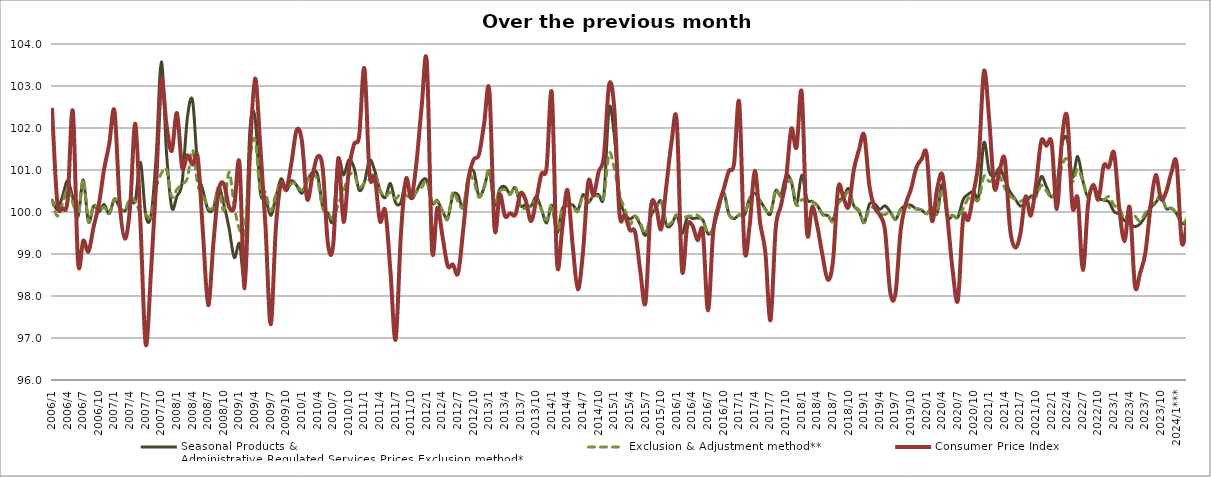
| Category | Seasonal Products &
Administrative Regulated Services Prices Exclusion method* | Exclusion & Adjustment method** | Consumer Price Index |
|---|---|---|---|
| 2006/1 | 100.292 | 100.289 | 102.48 |
| 2006/2 | 100.058 | 99.904 | 100.249 |
| 2006/3 | 100.367 | 100.199 | 100.091 |
| 2006/4 | 100.746 | 100.556 | 100.284 |
| 2006/5 | 100.337 | 100.21 | 102.403 |
| 2006/6 | 99.894 | 99.885 | 98.806 |
| 2006/7 | 100.763 | 100.777 | 99.319 |
| 2006/8 | 99.764 | 99.771 | 99.057 |
| 2006/9 | 100.145 | 100.175 | 99.652 |
| 2006/10 | 100.003 | 100.009 | 100.179 |
| 2006/11 | 100.179 | 100.118 | 101.012 |
| 2006/12 | 99.961 | 99.958 | 101.624 |
| 2007/1 | 100.309 | 100.32 | 102.405 |
| 2007/2 | 100.101 | 100.12 | 100.211 |
| 2007/3 | 100.026 | 100.035 | 99.366 |
| 2007/4 | 100.275 | 100.339 | 100.125 |
| 2007/5 | 100.272 | 100.245 | 102.102 |
| 2007/6 | 101.179 | 99.968 | 99.693 |
| 2007/7 | 99.924 | 99.937 | 96.845 |
| 2007/8 | 99.907 | 99.907 | 98.539 |
| 2007/9 | 101.308 | 100.57 | 100.675 |
| 2007/10 | 103.575 | 100.916 | 103.129 |
| 2007/11 | 101.402 | 101.015 | 102.068 |
| 2007/12 | 100.108 | 100.362 | 101.456 |
| 2008/1 | 100.375 | 100.542 | 102.354 |
| 2008/2 | 100.711 | 100.662 | 101.056 |
| 2008/3 | 102.242 | 100.806 | 101.354 |
| 2008/4 | 102.647 | 101.473 | 101.13 |
| 2008/5 | 101.034 | 100.651 | 101.298 |
| 2008/6 | 100.508 | 100.388 | 99.486 |
| 2008/7 | 100.048 | 100.096 | 97.781 |
| 2008/8 | 100.081 | 100.123 | 99.26 |
| 2008/9 | 100.588 | 100.588 | 100.502 |
| 2008/10 | 100.181 | 100.04 | 100.671 |
| 2008/11 | 99.622 | 100.951 | 100.125 |
| 2008/12 | 98.917 | 100.141 | 100.135 |
| 2009/1 | 99.254 | 99.591 | 101.178 |
| 2009/2 | 98.559 | 99.56 | 98.182 |
| 2009/3 | 101.924 | 101.24 | 101.351 |
| 2009/4 | 102.245 | 101.723 | 103.178 |
| 2009/5 | 100.478 | 100.482 | 101.589 |
| 2009/6 | 100.349 | 100.464 | 99.677 |
| 2009/7 | 99.916 | 100.025 | 97.325 |
| 2009/8 | 100.351 | 100.419 | 99.624 |
| 2009/9 | 100.791 | 100.693 | 100.688 |
| 2009/10 | 100.504 | 100.508 | 100.537 |
| 2009/11 | 100.744 | 100.686 | 101.178 |
| 2009/12 | 100.63 | 100.647 | 101.954 |
| 2010/1 | 100.443 | 100.514 | 101.687 |
| 2010/2 | 100.736 | 100.741 | 100.312 |
| 2010/3 | 100.939 | 100.895 | 100.843 |
| 2010/4 | 100.892 | 100.759 | 101.318 |
| 2010/5 | 100.109 | 100.09 | 101.035 |
| 2010/6 | 99.97 | 99.982 | 99.239 |
| 2010/7 | 99.811 | 99.838 | 99.202 |
| 2010/8 | 101.23 | 100.194 | 101.282 |
| 2010/9 | 100.877 | 100.492 | 99.766 |
| 2010/10 | 101.239 | 100.86 | 100.98 |
| 2010/11 | 101.065 | 100.897 | 101.608 |
| 2010/12 | 100.521 | 100.587 | 101.817 |
| 2011/1 | 100.709 | 100.686 | 103.419 |
| 2011/2 | 101.236 | 100.773 | 100.879 |
| 2011/3 | 100.975 | 100.91 | 100.821 |
| 2011/4 | 100.515 | 100.522 | 99.778 |
| 2011/5 | 100.343 | 100.372 | 100.035 |
| 2011/6 | 100.679 | 100.469 | 98.592 |
| 2011/7 | 100.219 | 100.314 | 96.965 |
| 2011/8 | 100.228 | 100.45 | 99.439 |
| 2011/9 | 100.733 | 100.402 | 100.788 |
| 2011/10 | 100.324 | 100.339 | 100.336 |
| 2011/11 | 100.491 | 100.477 | 101.175 |
| 2011/12 | 100.732 | 100.583 | 102.508 |
| 2012/1 | 100.754 | 100.738 | 103.563 |
| 2012/2 | 100.213 | 100.2 | 99.103 |
| 2012/3 | 100.264 | 100.282 | 100.099 |
| 2012/4 | 100.024 | 100.019 | 99.421 |
| 2012/5 | 99.854 | 99.827 | 98.718 |
| 2012/6 | 100.4 | 100.467 | 98.75 |
| 2012/7 | 100.402 | 100.246 | 98.542 |
| 2012/8 | 100.098 | 100.124 | 99.596 |
| 2012/9 | 100.844 | 100.847 | 100.796 |
| 2012/10 | 100.974 | 100.739 | 101.248 |
| 2012/11 | 100.374 | 100.353 | 101.365 |
| 2012/12 | 100.583 | 100.613 | 102.104 |
| 2013/1 | 100.979 | 101.013 | 102.893 |
| 2013/2 | 100.168 | 100.174 | 99.6 |
| 2013/3 | 100.547 | 100.499 | 100.42 |
| 2013/4 | 100.601 | 100.528 | 99.903 |
| 2013/5 | 100.432 | 100.416 | 99.968 |
| 2013/6 | 100.575 | 100.591 | 99.939 |
| 2013/7 | 100.151 | 100.113 | 100.447 |
| 2013/8 | 100.174 | 100.097 | 100.273 |
| 2013/9 | 100.139 | 100.151 | 99.781 |
| 2013/10 | 100.365 | 100.289 | 100.277 |
| 2013/11 | 100.072 | 100.053 | 100.902 |
| 2013/12 | 99.738 | 99.807 | 101.057 |
| 2014/1 | 100.162 | 100.178 | 102.828 |
| 2014/2 | 99.504 | 99.568 | 98.782 |
| 2014/3 | 100.073 | 100.038 | 99.614 |
| 2014/4 | 100.153 | 100.175 | 100.525 |
| 2014/5 | 100.171 | 100.139 | 99.214 |
| 2014/6 | 100.044 | 100.012 | 98.159 |
| 2014/7 | 100.413 | 100.396 | 99.063 |
| 2014/8 | 100.226 | 100.251 | 100.722 |
| 2014/9 | 100.396 | 100.375 | 100.403 |
| 2014/10 | 100.414 | 100.376 | 100.956 |
| 2014/11 | 100.393 | 100.364 | 101.322 |
| 2014/12 | 102.463 | 101.392 | 103.025 |
| 2015/1 | 101.821 | 101.037 | 102.462 |
| 2015/2 | 100.367 | 100.408 | 99.946 |
| 2015/3 | 99.989 | 100.081 | 99.927 |
| 2015/4 | 99.831 | 99.709 | 99.569 |
| 2015/5 | 99.9 | 99.906 | 99.52 |
| 2015/6 | 99.694 | 99.736 | 98.586 |
| 2015/7 | 99.446 | 99.491 | 97.848 |
| 2015/8 | 99.894 | 99.899 | 100.086 |
| 2015/9 | 100.098 | 100.106 | 100.131 |
| 2015/10 | 100.259 | 100.258 | 99.589 |
| 2015/11 | 99.69 | 99.734 | 100.622 |
| 2015/12 | 99.698 | 99.754 | 101.666 |
| 2016/1 | 99.924 | 99.92 | 102.157 |
| 2016/2 | 99.487 | 99.831 | 98.631 |
| 2016/3 | 99.864 | 99.898 | 99.667 |
| 2016/4 | 99.846 | 99.903 | 99.68 |
| 2016/5 | 99.855 | 99.925 | 99.331 |
| 2016/6 | 99.81 | 99.779 | 99.537 |
| 2016/7 | 99.481 | 99.503 | 97.657 |
| 2016/8 | 99.611 | 99.616 | 99.528 |
| 2016/9 | 100.045 | 100.065 | 100.143 |
| 2016/10 | 100.47 | 100.405 | 100.542 |
| 2016/11 | 99.951 | 99.957 | 100.973 |
| 2016/12 | 99.841 | 99.854 | 101.15 |
| 2017/1 | 99.935 | 99.929 | 102.603 |
| 2017/2 | 99.928 | 99.928 | 99.119 |
| 2017/3 | 100.323 | 100.303 | 99.69 |
| 2017/4 | 100.439 | 100.435 | 100.981 |
| 2017/5 | 100.27 | 100.273 | 99.754 |
| 2017/6 | 100.075 | 100.067 | 99.053 |
| 2017/7 | 99.954 | 99.988 | 97.425 |
| 2017/8 | 100.508 | 100.524 | 99.606 |
| 2017/9 | 100.401 | 100.36 | 100.15 |
| 2017/10 | 100.865 | 100.623 | 100.798 |
| 2017/11 | 100.724 | 100.738 | 101.978 |
| 2017/12 | 100.172 | 100.169 | 101.538 |
| 2018/1 | 100.875 | 100.293 | 102.844 |
| 2018/2 | 100.305 | 100.268 | 99.524 |
| 2018/3 | 100.253 | 100.238 | 100.127 |
| 2018/4 | 100.155 | 100.154 | 99.663 |
| 2018/5 | 99.948 | 99.933 | 98.96 |
| 2018/6 | 99.916 | 99.915 | 98.389 |
| 2018/7 | 99.816 | 99.769 | 98.825 |
| 2018/8 | 100.244 | 100.2 | 100.578 |
| 2018/9 | 100.343 | 100.299 | 100.343 |
| 2018/10 | 100.555 | 100.488 | 100.122 |
| 2018/11 | 100.148 | 100.153 | 101.004 |
| 2018/12 | 100.022 | 100.047 | 101.481 |
| 2019/1 | 99.745 | 99.753 | 101.834 |
| 2019/2 | 100.186 | 100.069 | 100.617 |
| 2019/3 | 100.194 | 100.095 | 100.111 |
| 2019/4 | 100.067 | 99.964 | 99.926 |
| 2019/5 | 100.147 | 99.939 | 99.556 |
| 2019/6 | 100.003 | 100.002 | 98.09 |
| 2019/7 | 99.82 | 99.826 | 98.056 |
| 2019/8 | 100.063 | 100.067 | 99.559 |
| 2019/9 | 100.153 | 100.173 | 100.195 |
| 2019/10 | 100.16 | 100.075 | 100.55 |
| 2019/11 | 100.074 | 100.075 | 101.051 |
| 2019/12 | 100.049 | 100.056 | 101.253 |
| 2020/1 | 99.957 | 99.961 | 101.377 |
| 2020/2 | 100.09 | 100.111 | 99.797 |
| 2020/3 | 99.963 | 99.959 | 100.544 |
| 2020/4 | 100.653 | 100.518 | 100.892 |
| 2020/5 | 99.878 | 99.951 | 99.855 |
| 2020/6 | 99.918 | 99.923 | 98.594 |
| 2020/7 | 99.879 | 99.876 | 97.903 |
| 2020/8 | 100.293 | 100.08 | 99.851 |
| 2020/9 | 100.424 | 100.325 | 99.817 |
| 2020/10 | 100.492 | 100.309 | 100.462 |
| 2020/11 | 100.375 | 100.296 | 101.265 |
| 2020/12 | 101.654 | 100.85 | 103.352 |
| 2021/1 | 100.966 | 100.726 | 102.209 |
| 2021/2 | 100.86 | 100.787 | 100.572 |
| 2021/3 | 101.049 | 100.842 | 100.978 |
| 2021/4 | 100.779 | 100.572 | 101.251 |
| 2021/5 | 100.485 | 100.388 | 99.614 |
| 2021/6 | 100.31 | 100.298 | 99.156 |
| 2021/7 | 100.142 | 100.254 | 99.482 |
| 2021/8 | 100.227 | 100.32 | 100.367 |
| 2021/9 | 100.379 | 100.337 | 99.915 |
| 2021/10 | 100.39 | 100.361 | 100.661 |
| 2021/11 | 100.842 | 100.635 | 101.685 |
| 2021/12 | 100.603 | 100.502 | 101.577 |
| 2022/1 | 100.354 | 100.335 | 101.641 |
| 2022/2 | 100.633 | 100.601 | 100.071 |
| 2022/3 | 101.622 | 101.101 | 101.754 |
| 2022/4 | 101.726 | 101.261 | 102.254 |
| 2022/5 | 100.829 | 100.729 | 100.129 |
| 2022/6 | 101.324 | 101.021 | 100.328 |
| 2022/7 | 100.746 | 100.732 | 98.623 |
| 2022/8 | 100.345 | 100.369 | 100.19 |
| 2022/9 | 100.661 | 100.664 | 100.635 |
| 2022/10 | 100.342 | 100.318 | 100.3 |
| 2022/11 | 100.283 | 100.285 | 101.098 |
| 2022/12 | 100.24 | 100.368 | 101.071 |
| 2023/1 | 100.006 | 100.161 | 101.405 |
| 2023/2 | 99.948 | 100.078 | 100.07 |
| 2023/3 | 99.793 | 99.85 | 99.305 |
| 2023/4 | 99.716 | 99.979 | 100.108 |
| 2023/5 | 99.652 | 99.904 | 98.238 |
| 2023/6 | 99.717 | 99.782 | 98.551 |
| 2023/7 | 99.899 | 99.977 | 99.026 |
| 2023/8 | 100.099 | 100.158 | 100.122 |
| 2023/9 | 100.226 | 100.25 | 100.881 |
| 2023/10 | 100.377 | 100.404 | 100.306 |
| 2023/11 | 100.085 | 100.08 | 100.481 |
| 2023/12 | 100.09 | 100.084 | 100.938 |
| 2024/1*** | 99.959 | 99.959 | 101.161 |
| 2024/2 | 99.734 | 99.709 | 99.271 |
| 2024/3 | 99.737 | 99.85 | 99.759 |